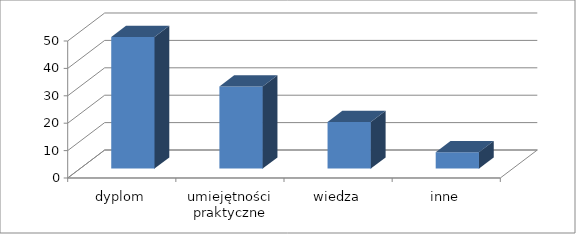
| Category | Ogółem |
|---|---|
| dyplom | 48 |
| umiejętności praktyczne | 30 |
| wiedza | 17 |
| inne | 6 |